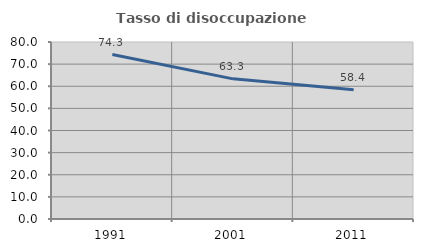
| Category | Tasso di disoccupazione giovanile  |
|---|---|
| 1991.0 | 74.309 |
| 2001.0 | 63.342 |
| 2011.0 | 58.426 |